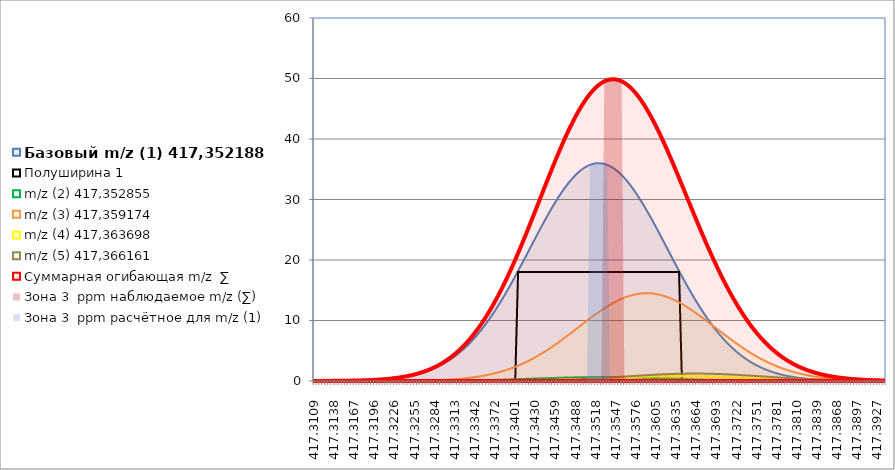
| Category | Базовый m/z (1) 417,352188 | Полуширина 1 | m/z (2) 417,352855 | m/z (3) 417,359174 | m/z (4) 417,363698 | m/z (5) 417,366161 | Суммарная огибающая m/z  ∑ | Зона 3  ppm наблюдаемое m/z (∑) | Зона 3  ppm расчётное для m/z (1) |
|---|---|---|---|---|---|---|---|---|---|
| 417.310870133388 | 0.007 | 0 | 0 | 0 | 0 | 0 | 0.007 | 0 | 0 |
| 417.31128748557603 | 0.008 | 0 | 0 | 0 | 0 | 0 | 0.009 | 0 | 0 |
| 417.311704837764 | 0.01 | 0 | 0 | 0 | 0 | 0 | 0.01 | 0 | 0 |
| 417.312122189952 | 0.012 | 0 | 0 | 0 | 0 | 0 | 0.012 | 0 | 0 |
| 417.31253954214003 | 0.014 | 0 | 0 | 0 | 0 | 0 | 0.014 | 0 | 0 |
| 417.312956894328 | 0.016 | 0 | 0 | 0 | 0 | 0 | 0.017 | 0 | 0 |
| 417.313374246516 | 0.019 | 0 | 0 | 0 | 0 | 0 | 0.02 | 0 | 0 |
| 417.31379159870403 | 0.023 | 0 | 0 | 0 | 0 | 0 | 0.023 | 0 | 0 |
| 417.314208950892 | 0.027 | 0 | 0 | 0.001 | 0 | 0 | 0.028 | 0 | 0 |
| 417.31462630308 | 0.031 | 0 | 0 | 0.001 | 0 | 0 | 0.032 | 0 | 0 |
| 417.315043655268 | 0.036 | 0 | 0.001 | 0.001 | 0 | 0 | 0.038 | 0 | 0 |
| 417.315461007456 | 0.042 | 0 | 0.001 | 0.001 | 0 | 0 | 0.044 | 0 | 0 |
| 417.315878359644 | 0.049 | 0 | 0.001 | 0.001 | 0 | 0 | 0.051 | 0 | 0 |
| 417.316295711832 | 0.057 | 0 | 0.001 | 0.001 | 0 | 0 | 0.06 | 0 | 0 |
| 417.31671306402 | 0.067 | 0 | 0.001 | 0.002 | 0 | 0 | 0.069 | 0 | 0 |
| 417.317130416208 | 0.077 | 0 | 0.001 | 0.002 | 0 | 0 | 0.08 | 0 | 0 |
| 417.317547768396 | 0.089 | 0 | 0.001 | 0.003 | 0 | 0 | 0.093 | 0 | 0 |
| 417.317965120584 | 0.103 | 0 | 0.001 | 0.003 | 0 | 0 | 0.108 | 0 | 0 |
| 417.318382472772 | 0.119 | 0 | 0.002 | 0.004 | 0 | 0 | 0.124 | 0 | 0 |
| 417.31879982496 | 0.137 | 0 | 0.002 | 0.004 | 0 | 0 | 0.143 | 0 | 0 |
| 417.319217177148 | 0.157 | 0 | 0.002 | 0.005 | 0 | 0 | 0.164 | 0 | 0 |
| 417.319634529336 | 0.18 | 0 | 0.003 | 0.006 | 0 | 0 | 0.189 | 0 | 0 |
| 417.320051881524 | 0.206 | 0 | 0.003 | 0.007 | 0 | 0 | 0.216 | 0 | 0 |
| 417.320469233712 | 0.235 | 0 | 0.003 | 0.008 | 0 | 0 | 0.247 | 0 | 0 |
| 417.3208865859 | 0.268 | 0 | 0.004 | 0.01 | 0 | 0 | 0.282 | 0 | 0 |
| 417.321303938088 | 0.306 | 0 | 0.005 | 0.011 | 0 | 0 | 0.321 | 0 | 0 |
| 417.321721290276 | 0.347 | 0 | 0.005 | 0.013 | 0 | 0 | 0.366 | 0 | 0 |
| 417.32213864246404 | 0.394 | 0 | 0.006 | 0.015 | 0 | 0 | 0.415 | 0 | 0 |
| 417.322555994652 | 0.446 | 0 | 0.007 | 0.018 | 0 | 0 | 0.471 | 0 | 0 |
| 417.32297334684 | 0.505 | 0 | 0.008 | 0.021 | 0 | 0 | 0.533 | 0 | 0 |
| 417.32339069902804 | 0.57 | 0 | 0.009 | 0.024 | 0 | 0 | 0.603 | 0 | 0 |
| 417.323808051216 | 0.642 | 0 | 0.01 | 0.028 | 0 | 0 | 0.68 | 0 | 0 |
| 417.324225403404 | 0.722 | 0 | 0.011 | 0.032 | 0 | 0 | 0.766 | 0 | 0 |
| 417.32464275559204 | 0.811 | 0 | 0.012 | 0.037 | 0 | 0 | 0.861 | 0 | 0 |
| 417.32506010778 | 0.908 | 0 | 0.014 | 0.043 | 0 | 0 | 0.966 | 0 | 0 |
| 417.325477459968 | 1.016 | 0 | 0.015 | 0.05 | 0.001 | 0 | 1.082 | 0 | 0 |
| 417.32589481215604 | 1.135 | 0 | 0.017 | 0.057 | 0.001 | 0 | 1.211 | 0 | 0 |
| 417.326312164344 | 1.266 | 0 | 0.019 | 0.066 | 0.001 | 0 | 1.352 | 0 | 0 |
| 417.326729516532 | 1.409 | 0 | 0.022 | 0.075 | 0.001 | 0.001 | 1.507 | 0 | 0 |
| 417.32714686872004 | 1.566 | 0 | 0.024 | 0.086 | 0.001 | 0.001 | 1.677 | 0 | 0 |
| 417.327564220908 | 1.737 | 0 | 0.027 | 0.098 | 0.001 | 0.001 | 1.864 | 0 | 0 |
| 417.327981573096 | 1.923 | 0 | 0.03 | 0.112 | 0.001 | 0.001 | 2.067 | 0 | 0 |
| 417.32839892528403 | 2.126 | 0 | 0.033 | 0.127 | 0.002 | 0.001 | 2.288 | 0 | 0 |
| 417.328816277472 | 2.345 | 0 | 0.036 | 0.145 | 0.002 | 0.001 | 2.529 | 0 | 0 |
| 417.32923362966 | 2.583 | 0 | 0.04 | 0.164 | 0.002 | 0.001 | 2.791 | 0 | 0 |
| 417.32965098184803 | 2.841 | 0 | 0.044 | 0.186 | 0.002 | 0.002 | 3.075 | 0 | 0 |
| 417.330068334036 | 3.118 | 0 | 0.049 | 0.21 | 0.003 | 0.002 | 3.382 | 0 | 0 |
| 417.330485686224 | 3.417 | 0 | 0.054 | 0.237 | 0.003 | 0.002 | 3.713 | 0 | 0 |
| 417.33090303841203 | 3.737 | 0 | 0.059 | 0.267 | 0.004 | 0.002 | 4.069 | 0 | 0 |
| 417.3313203906 | 4.081 | 0 | 0.064 | 0.3 | 0.004 | 0.003 | 4.453 | 0 | 0 |
| 417.331737742788 | 4.448 | 0 | 0.07 | 0.337 | 0.005 | 0.003 | 4.864 | 0 | 0 |
| 417.33215509497603 | 4.841 | 0 | 0.077 | 0.377 | 0.006 | 0.004 | 5.304 | 0 | 0 |
| 417.332572447164 | 5.258 | 0 | 0.084 | 0.422 | 0.006 | 0.004 | 5.774 | 0 | 0 |
| 417.332989799352 | 5.702 | 0 | 0.091 | 0.471 | 0.007 | 0.005 | 6.276 | 0 | 0 |
| 417.33340715154003 | 6.172 | 0 | 0.099 | 0.525 | 0.008 | 0.006 | 6.81 | 0 | 0 |
| 417.333824503728 | 6.669 | 0 | 0.107 | 0.584 | 0.009 | 0.007 | 7.376 | 0 | 0 |
| 417.334241855916 | 7.194 | 0 | 0.116 | 0.649 | 0.011 | 0.008 | 7.977 | 0 | 0 |
| 417.33465920810403 | 7.747 | 0 | 0.125 | 0.719 | 0.012 | 0.009 | 8.612 | 0 | 0 |
| 417.335076560292 | 8.328 | 0 | 0.135 | 0.796 | 0.014 | 0.01 | 9.282 | 0 | 0 |
| 417.33549391248 | 8.937 | 0 | 0.145 | 0.879 | 0.015 | 0.011 | 9.987 | 0 | 0 |
| 417.335911264668 | 9.573 | 0 | 0.156 | 0.97 | 0.017 | 0.013 | 10.729 | 0 | 0 |
| 417.336328616856 | 10.237 | 0 | 0.167 | 1.068 | 0.019 | 0.014 | 11.506 | 0 | 0 |
| 417.336745969044 | 10.928 | 0 | 0.179 | 1.173 | 0.022 | 0.016 | 12.318 | 0 | 0 |
| 417.337163321232 | 11.646 | 0 | 0.191 | 1.287 | 0.024 | 0.018 | 13.167 | 0 | 0 |
| 417.33758067342 | 12.388 | 0 | 0.204 | 1.41 | 0.027 | 0.021 | 14.05 | 0 | 0 |
| 417.337998025608 | 13.156 | 0 | 0.217 | 1.542 | 0.03 | 0.023 | 14.968 | 0 | 0 |
| 417.338415377796 | 13.946 | 0 | 0.231 | 1.683 | 0.034 | 0.026 | 15.919 | 0 | 0 |
| 417.338832729984 | 14.758 | 0 | 0.245 | 1.833 | 0.037 | 0.029 | 16.903 | 0 | 0 |
| 417.339250082172 | 15.591 | 0 | 0.259 | 1.994 | 0.041 | 0.033 | 17.918 | 0 | 0 |
| 417.33966743436 | 16.441 | 0 | 0.274 | 2.165 | 0.046 | 0.037 | 18.963 | 0 | 0 |
| 417.340084786548 | 17.308 | 0 | 0.289 | 2.347 | 0.051 | 0.041 | 20.036 | 0 | 0 |
| 417.340502138736 | 18.189 | 18.002 | 0.305 | 2.539 | 0.056 | 0.046 | 21.135 | 0 | 0 |
| 417.340919490924 | 19.082 | 18.002 | 0.321 | 2.743 | 0.061 | 0.051 | 22.257 | 0 | 0 |
| 417.341336843112 | 19.983 | 18.002 | 0.337 | 2.957 | 0.067 | 0.056 | 23.401 | 0 | 0 |
| 417.34175419530004 | 20.891 | 18.002 | 0.353 | 3.183 | 0.074 | 0.062 | 24.563 | 0 | 0 |
| 417.342171547488 | 21.802 | 18.002 | 0.37 | 3.42 | 0.081 | 0.069 | 25.741 | 0 | 0 |
| 417.342588899676 | 22.713 | 18.002 | 0.386 | 3.668 | 0.089 | 0.076 | 26.932 | 0 | 0 |
| 417.34300625186404 | 23.62 | 18.002 | 0.403 | 3.928 | 0.097 | 0.084 | 28.132 | 0 | 0 |
| 417.343423604052 | 24.522 | 18.002 | 0.419 | 4.198 | 0.105 | 0.093 | 29.337 | 0 | 0 |
| 417.34384095624 | 25.413 | 18.002 | 0.436 | 4.48 | 0.114 | 0.102 | 30.545 | 0 | 0 |
| 417.34425830842804 | 26.291 | 18.002 | 0.452 | 4.771 | 0.124 | 0.112 | 31.75 | 0 | 0 |
| 417.344675660616 | 27.152 | 18.002 | 0.468 | 5.073 | 0.135 | 0.122 | 32.95 | 0 | 0 |
| 417.345093012804 | 27.992 | 18.002 | 0.484 | 5.385 | 0.146 | 0.133 | 34.141 | 0 | 0 |
| 417.34551036499204 | 28.809 | 18.002 | 0.499 | 5.706 | 0.157 | 0.146 | 35.317 | 0 | 0 |
| 417.34592771718 | 29.597 | 18.002 | 0.515 | 6.036 | 0.17 | 0.159 | 36.476 | 0 | 0 |
| 417.346345069368 | 30.354 | 18.002 | 0.529 | 6.373 | 0.182 | 0.172 | 37.611 | 0 | 0 |
| 417.34676242155604 | 31.076 | 18.002 | 0.543 | 6.718 | 0.196 | 0.187 | 38.721 | 0 | 0 |
| 417.347179773744 | 31.76 | 18.002 | 0.557 | 7.069 | 0.21 | 0.203 | 39.799 | 0 | 0 |
| 417.347597125932 | 32.403 | 18.002 | 0.57 | 7.425 | 0.225 | 0.219 | 40.842 | 0 | 0 |
| 417.34801447812004 | 33.001 | 18.002 | 0.582 | 7.786 | 0.24 | 0.237 | 41.846 | 0 | 0 |
| 417.348431830308 | 33.552 | 18.002 | 0.593 | 8.15 | 0.256 | 0.255 | 42.807 | 0 | 0 |
| 417.348849182496 | 34.052 | 18.002 | 0.604 | 8.517 | 0.273 | 0.274 | 43.72 | 0 | 0 |
| 417.34926653468403 | 34.5 | 18.002 | 0.613 | 8.884 | 0.29 | 0.295 | 44.582 | 0 | 0 |
| 417.349683886872 | 34.893 | 18.002 | 0.622 | 9.251 | 0.308 | 0.316 | 45.39 | 0 | 0 |
| 417.35010123906 | 35.229 | 18.002 | 0.63 | 9.616 | 0.326 | 0.338 | 46.139 | 0 | 0 |
| 417.35051859124803 | 35.506 | 18.002 | 0.636 | 9.979 | 0.345 | 0.361 | 46.827 | 0 | 0 |
| 417.350935943436 | 35.723 | 18.002 | 0.642 | 10.337 | 0.364 | 0.385 | 47.451 | 0 | 35.723 |
| 417.351353295624 | 35.879 | 18.002 | 0.647 | 10.689 | 0.384 | 0.41 | 48.009 | 0 | 35.879 |
| 417.35177064781203 | 35.973 | 18.002 | 0.65 | 11.034 | 0.404 | 0.436 | 48.497 | 0 | 35.973 |
| 417.352188 | 36.004 | 18.002 | 0.653 | 11.37 | 0.424 | 0.463 | 48.914 | 0 | 36.004 |
| 417.352605352188 | 35.973 | 18.002 | 0.654 | 11.697 | 0.444 | 0.49 | 49.258 | 0 | 35.973 |
| 417.35302270437603 | 35.879 | 18.002 | 0.654 | 12.011 | 0.465 | 0.518 | 49.527 | 49.527 | 35.879 |
| 417.353440056564 | 35.723 | 18.002 | 0.653 | 12.313 | 0.486 | 0.547 | 49.721 | 49.721 | 35.723 |
| 417.353857408752 | 35.506 | 18.002 | 0.651 | 12.6 | 0.507 | 0.576 | 49.839 | 49.839 | 0 |
| 417.35427476094003 | 35.229 | 18.002 | 0.648 | 12.872 | 0.527 | 0.606 | 49.881 | 49.881 | 0 |
| 417.354692113128 | 34.893 | 18.002 | 0.643 | 13.126 | 0.548 | 0.636 | 49.846 | 49.846 | 0 |
| 417.355109465316 | 34.5 | 18.002 | 0.638 | 13.362 | 0.569 | 0.667 | 49.735 | 49.735 | 0 |
| 417.355526817504 | 34.052 | 18.002 | 0.631 | 13.579 | 0.589 | 0.698 | 49.549 | 49.549 | 0 |
| 417.355944169692 | 33.552 | 18.002 | 0.624 | 13.775 | 0.609 | 0.729 | 49.288 | 0 | 0 |
| 417.35636152188 | 33.001 | 18.002 | 0.615 | 13.95 | 0.628 | 0.76 | 48.954 | 0 | 0 |
| 417.356778874068 | 32.403 | 18.002 | 0.606 | 14.103 | 0.647 | 0.791 | 48.549 | 0 | 0 |
| 417.357196226256 | 31.76 | 18.002 | 0.595 | 14.232 | 0.665 | 0.822 | 48.075 | 0 | 0 |
| 417.357613578444 | 31.076 | 18.002 | 0.584 | 14.337 | 0.683 | 0.852 | 47.533 | 0 | 0 |
| 417.358030930632 | 30.354 | 18.002 | 0.572 | 14.418 | 0.7 | 0.883 | 46.927 | 0 | 0 |
| 417.35844828282 | 29.597 | 18.002 | 0.559 | 14.475 | 0.716 | 0.912 | 46.26 | 0 | 0 |
| 417.358865635008 | 28.809 | 18.002 | 0.546 | 14.506 | 0.732 | 0.941 | 45.533 | 0 | 0 |
| 417.359282987196 | 27.992 | 18.002 | 0.532 | 14.512 | 0.746 | 0.97 | 44.752 | 0 | 0 |
| 417.359700339384 | 27.152 | 18.002 | 0.517 | 14.493 | 0.759 | 0.997 | 43.918 | 0 | 0 |
| 417.360117691572 | 26.291 | 18.002 | 0.502 | 14.448 | 0.771 | 1.023 | 43.036 | 0 | 0 |
| 417.36053504376 | 25.413 | 18.002 | 0.487 | 14.379 | 0.782 | 1.048 | 42.11 | 0 | 0 |
| 417.360952395948 | 24.522 | 18.002 | 0.471 | 14.285 | 0.792 | 1.072 | 41.142 | 0 | 0 |
| 417.361369748136 | 23.62 | 18.002 | 0.455 | 14.167 | 0.8 | 1.095 | 40.138 | 0 | 0 |
| 417.361787100324 | 22.713 | 18.002 | 0.439 | 14.026 | 0.807 | 1.116 | 39.101 | 0 | 0 |
| 417.362204452512 | 21.802 | 18.002 | 0.422 | 13.862 | 0.813 | 1.136 | 38.034 | 0 | 0 |
| 417.3626218047 | 20.891 | 18.002 | 0.406 | 13.675 | 0.817 | 1.154 | 36.943 | 0 | 0 |
| 417.363039156888 | 19.983 | 18.002 | 0.389 | 13.468 | 0.82 | 1.17 | 35.831 | 0 | 0 |
| 417.363456509076 | 19.082 | 18.002 | 0.373 | 13.241 | 0.822 | 1.184 | 34.702 | 0 | 0 |
| 417.36387386126404 | 18.189 | 18.002 | 0.356 | 12.995 | 0.822 | 1.197 | 33.56 | 0 | 0 |
| 417.364291213452 | 17.308 | 0 | 0.34 | 12.732 | 0.821 | 1.207 | 32.408 | 0 | 0 |
| 417.36470856564 | 16.441 | 0 | 0.324 | 12.452 | 0.818 | 1.215 | 31.251 | 0 | 0 |
| 417.36512591782804 | 15.591 | 0 | 0.308 | 12.157 | 0.814 | 1.222 | 30.091 | 0 | 0 |
| 417.365543270016 | 14.758 | 0 | 0.292 | 11.848 | 0.808 | 1.226 | 28.933 | 0 | 0 |
| 417.365960622204 | 13.946 | 0 | 0.277 | 11.528 | 0.801 | 1.228 | 27.78 | 0 | 0 |
| 417.36637797439204 | 13.156 | 0 | 0.262 | 11.196 | 0.793 | 1.228 | 26.635 | 0 | 0 |
| 417.36679532658 | 12.388 | 0 | 0.248 | 10.855 | 0.784 | 1.226 | 25.5 | 0 | 0 |
| 417.367212678768 | 11.646 | 0 | 0.233 | 10.506 | 0.773 | 1.221 | 24.379 | 0 | 0 |
| 417.36763003095604 | 10.928 | 0 | 0.22 | 10.15 | 0.761 | 1.215 | 23.274 | 0 | 0 |
| 417.368047383144 | 10.237 | 0 | 0.206 | 9.79 | 0.748 | 1.207 | 22.188 | 0 | 0 |
| 417.368464735332 | 9.573 | 0 | 0.193 | 9.426 | 0.734 | 1.196 | 21.122 | 0 | 0 |
| 417.36888208752003 | 8.937 | 0 | 0.181 | 9.059 | 0.719 | 1.184 | 20.08 | 0 | 0 |
| 417.369299439708 | 8.328 | 0 | 0.169 | 8.692 | 0.703 | 1.169 | 19.061 | 0 | 0 |
| 417.369716791896 | 7.747 | 0 | 0.158 | 8.325 | 0.686 | 1.153 | 18.069 | 0 | 0 |
| 417.37013414408403 | 7.194 | 0 | 0.147 | 7.96 | 0.668 | 1.135 | 17.105 | 0 | 0 |
| 417.370551496272 | 6.669 | 0 | 0.137 | 7.597 | 0.65 | 1.115 | 16.169 | 0 | 0 |
| 417.37096884846 | 6.172 | 0 | 0.127 | 7.239 | 0.631 | 1.094 | 15.263 | 0 | 0 |
| 417.37138620064803 | 5.702 | 0 | 0.117 | 6.885 | 0.612 | 1.072 | 14.388 | 0 | 0 |
| 417.371803552836 | 5.258 | 0 | 0.109 | 6.537 | 0.592 | 1.047 | 13.543 | 0 | 0 |
| 417.372220905024 | 4.841 | 0 | 0.1 | 6.196 | 0.572 | 1.022 | 12.731 | 0 | 0 |
| 417.37263825721203 | 4.448 | 0 | 0.092 | 5.863 | 0.551 | 0.996 | 11.951 | 0 | 0 |
| 417.3730556094 | 4.081 | 0 | 0.085 | 5.537 | 0.531 | 0.968 | 11.203 | 0 | 0 |
| 417.373472961588 | 3.737 | 0 | 0.078 | 5.221 | 0.51 | 0.94 | 10.487 | 0 | 0 |
| 417.37389031377603 | 3.417 | 0 | 0.072 | 4.914 | 0.489 | 0.911 | 9.803 | 0 | 0 |
| 417.374307665964 | 3.118 | 0 | 0.066 | 4.618 | 0.468 | 0.881 | 9.151 | 0 | 0 |
| 417.374725018152 | 2.841 | 0 | 0.06 | 4.331 | 0.448 | 0.851 | 8.531 | 0 | 0 |
| 417.37514237034003 | 2.583 | 0 | 0.055 | 4.056 | 0.427 | 0.821 | 7.941 | 0 | 0 |
| 417.375559722528 | 2.345 | 0 | 0.05 | 3.791 | 0.407 | 0.79 | 7.382 | 0 | 0 |
| 417.375977074716 | 2.126 | 0 | 0.045 | 3.537 | 0.387 | 0.759 | 6.853 | 0 | 0 |
| 417.376394426904 | 1.923 | 0 | 0.041 | 3.295 | 0.367 | 0.728 | 6.353 | 0 | 0 |
| 417.376811779092 | 1.737 | 0 | 0.037 | 3.064 | 0.348 | 0.697 | 5.882 | 0 | 0 |
| 417.37722913128 | 1.566 | 0 | 0.034 | 2.844 | 0.329 | 0.666 | 5.438 | 0 | 0 |
| 417.377646483468 | 1.409 | 0 | 0.03 | 2.635 | 0.311 | 0.635 | 5.02 | 0 | 0 |
| 417.378063835656 | 1.266 | 0 | 0.027 | 2.437 | 0.293 | 0.605 | 4.628 | 0 | 0 |
| 417.378481187844 | 1.135 | 0 | 0.025 | 2.251 | 0.276 | 0.575 | 4.261 | 0 | 0 |
| 417.378898540032 | 1.016 | 0 | 0.022 | 2.075 | 0.259 | 0.546 | 3.918 | 0 | 0 |
| 417.37931589222 | 0.908 | 0 | 0.02 | 1.909 | 0.243 | 0.517 | 3.597 | 0 | 0 |
| 417.379733244408 | 0.811 | 0 | 0.018 | 1.754 | 0.227 | 0.489 | 3.298 | 0 | 0 |
| 417.380150596596 | 0.722 | 0 | 0.016 | 1.608 | 0.212 | 0.462 | 3.02 | 0 | 0 |
| 417.380567948784 | 0.642 | 0 | 0.014 | 1.472 | 0.198 | 0.435 | 2.761 | 0 | 0 |
| 417.380985300972 | 0.57 | 0 | 0.013 | 1.345 | 0.184 | 0.409 | 2.521 | 0 | 0 |
| 417.38140265316 | 0.505 | 0 | 0.011 | 1.227 | 0.172 | 0.384 | 2.299 | 0 | 0 |
| 417.381820005348 | 0.446 | 0 | 0.01 | 1.117 | 0.159 | 0.36 | 2.093 | 0 | 0 |
| 417.382237357536 | 0.394 | 0 | 0.009 | 1.016 | 0.147 | 0.337 | 1.903 | 0 | 0 |
| 417.382654709724 | 0.347 | 0 | 0.008 | 0.922 | 0.136 | 0.315 | 1.728 | 0 | 0 |
| 417.383072061912 | 0.306 | 0 | 0.007 | 0.835 | 0.126 | 0.294 | 1.567 | 0 | 0 |
| 417.38348941410004 | 0.268 | 0 | 0.006 | 0.755 | 0.116 | 0.274 | 1.419 | 0 | 0 |
| 417.383906766288 | 0.235 | 0 | 0.005 | 0.681 | 0.107 | 0.254 | 1.283 | 0 | 0 |
| 417.384324118476 | 0.206 | 0 | 0.005 | 0.614 | 0.098 | 0.236 | 1.159 | 0 | 0 |
| 417.38474147066404 | 0.18 | 0 | 0.004 | 0.552 | 0.09 | 0.219 | 1.045 | 0 | 0 |
| 417.385158822852 | 0.157 | 0 | 0.004 | 0.496 | 0.082 | 0.202 | 0.941 | 0 | 0 |
| 417.38557617504 | 0.137 | 0 | 0.003 | 0.445 | 0.075 | 0.187 | 0.846 | 0 | 0 |
| 417.38599352722804 | 0.119 | 0 | 0.003 | 0.398 | 0.068 | 0.172 | 0.76 | 0 | 0 |
| 417.386410879416 | 0.103 | 0 | 0.002 | 0.356 | 0.062 | 0.158 | 0.681 | 0 | 0 |
| 417.386828231604 | 0.089 | 0 | 0.002 | 0.317 | 0.057 | 0.145 | 0.61 | 0 | 0 |
| 417.38724558379204 | 0.077 | 0 | 0.002 | 0.282 | 0.051 | 0.133 | 0.546 | 0 | 0 |
| 417.38766293598 | 0.067 | 0 | 0.002 | 0.251 | 0.047 | 0.122 | 0.487 | 0 | 0 |
| 417.388080288168 | 0.057 | 0 | 0.001 | 0.222 | 0.042 | 0.111 | 0.434 | 0 | 0 |
| 417.38849764035604 | 0.049 | 0 | 0.001 | 0.197 | 0.038 | 0.101 | 0.387 | 0 | 0 |
| 417.388914992544 | 0.042 | 0 | 0.001 | 0.174 | 0.034 | 0.092 | 0.344 | 0 | 0 |
| 417.389332344732 | 0.036 | 0 | 0.001 | 0.154 | 0.031 | 0.084 | 0.305 | 0 | 0 |
| 417.38974969692003 | 0.031 | 0 | 0.001 | 0.135 | 0.028 | 0.076 | 0.271 | 0 | 0 |
| 417.390167049108 | 0.027 | 0 | 0.001 | 0.119 | 0.025 | 0.069 | 0.24 | 0 | 0 |
| 417.390584401296 | 0.023 | 0 | 0.001 | 0.105 | 0.022 | 0.062 | 0.212 | 0 | 0 |
| 417.39100175348403 | 0.019 | 0 | 0 | 0.092 | 0.02 | 0.056 | 0.187 | 0 | 0 |
| 417.391419105672 | 0.016 | 0 | 0 | 0.08 | 0.018 | 0.051 | 0.165 | 0 | 0 |
| 417.39183645786 | 0.014 | 0 | 0 | 0.07 | 0.016 | 0.045 | 0.145 | 0 | 0 |
| 417.39225381004803 | 0.012 | 0 | 0 | 0.061 | 0.014 | 0.041 | 0.128 | 0 | 0 |
| 417.392671162236 | 0.01 | 0 | 0 | 0.053 | 0.012 | 0.037 | 0.112 | 0 | 0 |
| 417.393088514424 | 0.008 | 0 | 0 | 0.046 | 0.011 | 0.033 | 0.098 | 0 | 0 |
| 417.39350586661203 | 0.007 | 0 | 0 | 0.04 | 0.01 | 0.029 | 0.086 | 0 | 0 |
| 417.3939232188 | 0.006 | 0 | 0 | 0.035 | 0.009 | 0.026 | 0.075 | 0 | 0 |